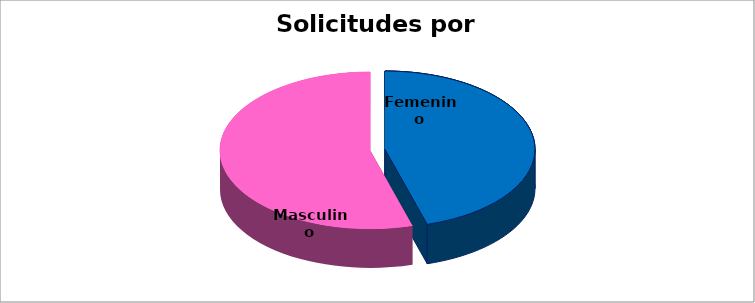
| Category | Series 0 |
|---|---|
| Femenino | 145 |
| Masculino | 174 |